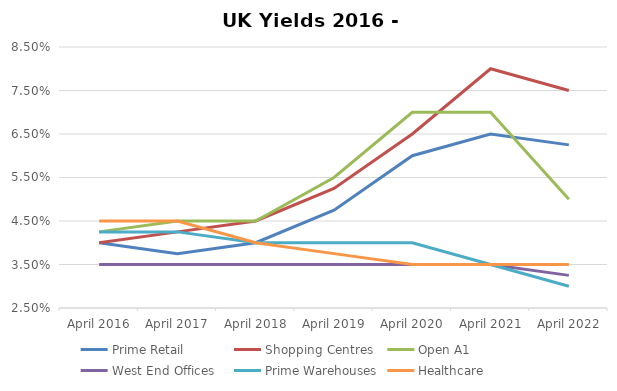
| Category | Prime Retail | Shopping Centres | Open A1  | West End Offices | Prime Warehouses | Healthcare |
|---|---|---|---|---|---|---|
| 2016-04-30 | 0.04 | 0.04 | 0.042 | 0.035 | 0.042 | 0.045 |
| 2017-04-30 | 0.038 | 0.042 | 0.045 | 0.035 | 0.042 | 0.045 |
| 2018-04-30 | 0.04 | 0.045 | 0.045 | 0.035 | 0.04 | 0.04 |
| 2019-04-30 | 0.048 | 0.052 | 0.055 | 0.035 | 0.04 | 0.038 |
| 2020-04-30 | 0.06 | 0.065 | 0.07 | 0.035 | 0.04 | 0.035 |
| 2021-04-30 | 0.065 | 0.08 | 0.07 | 0.035 | 0.035 | 0.035 |
| 2022-04-30 | 0.062 | 0.075 | 0.05 | 0.032 | 0.03 | 0.035 |